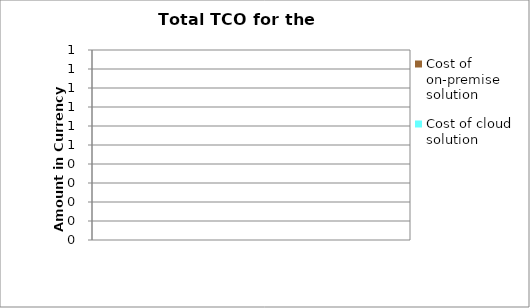
| Category | Cost of on-premise solution | Cost of cloud solution |
|---|---|---|
| 5.0 | 0 | 0 |